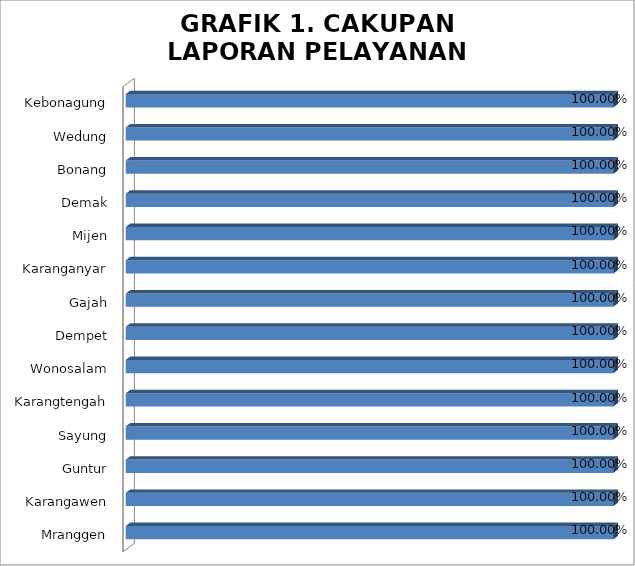
| Category | Series 0 |
|---|---|
| Mranggen | 1 |
| Karangawen | 1 |
| Guntur | 1 |
| Sayung | 1 |
| Karangtengah | 1 |
| Wonosalam | 1 |
| Dempet | 1 |
| Gajah | 1 |
| Karanganyar | 1 |
| Mijen | 1 |
| Demak | 1 |
| Bonang | 1 |
| Wedung | 1 |
| Kebonagung | 1 |